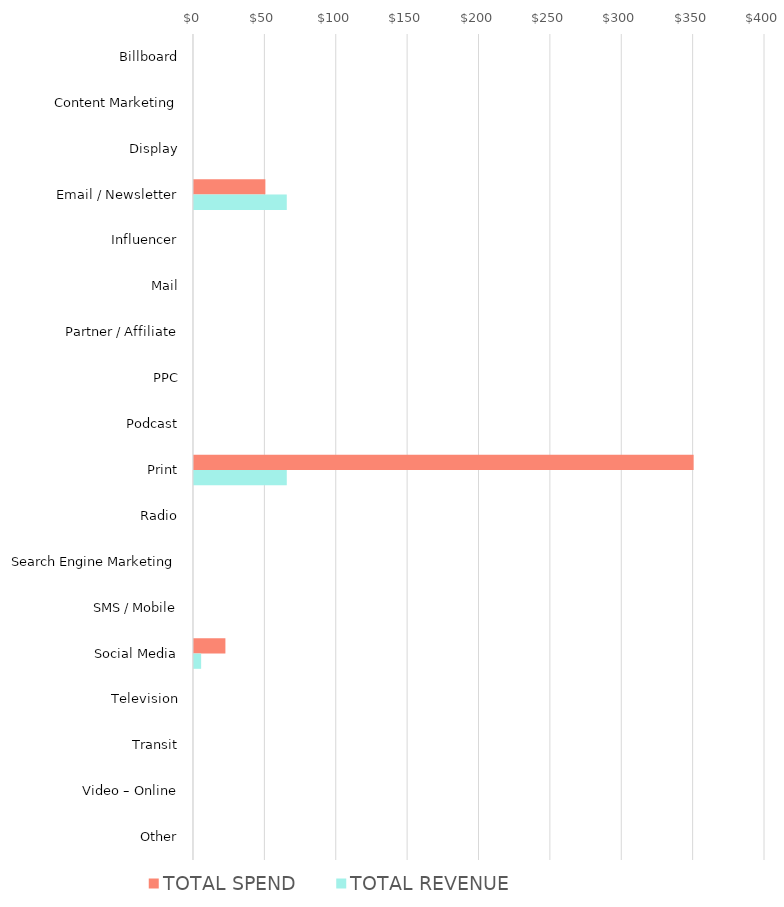
| Category | TOTAL SPEND | TOTAL REVENUE |
|---|---|---|
| Billboard | 0 | 0 |
| Content Marketing | 0 | 0 |
| Display | 0 | 0 |
| Email / Newsletter | 50 | 65 |
| Influencer | 0 | 0 |
| Mail | 0 | 0 |
| Partner / Affiliate | 0 | 0 |
| PPC | 0 | 0 |
| Podcast | 0 | 0 |
| Print | 350 | 65 |
| Radio | 0 | 0 |
| Search Engine Marketing | 0 | 0 |
| SMS / Mobile | 0 | 0 |
| Social Media | 22 | 5 |
| Television | 0 | 0 |
| Transit | 0 | 0 |
| Video – Online | 0 | 0 |
| Other | 0 | 0 |